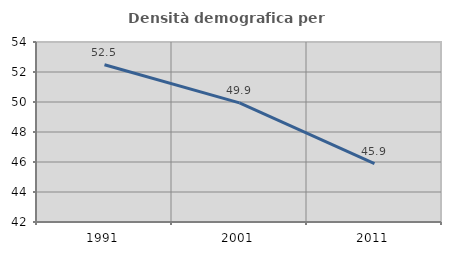
| Category | Densità demografica |
|---|---|
| 1991.0 | 52.487 |
| 2001.0 | 49.942 |
| 2011.0 | 45.895 |